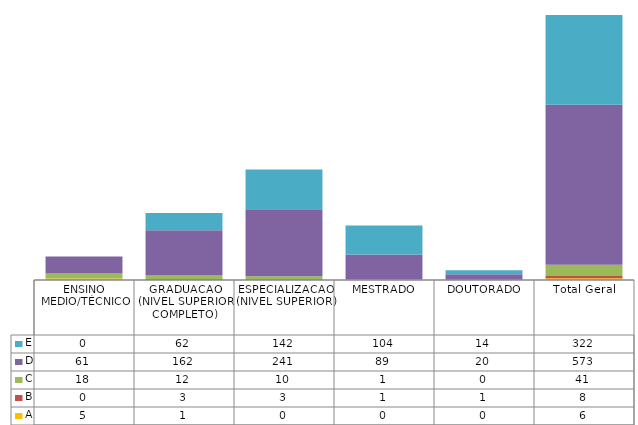
| Category | A | B | C | D | E |
|---|---|---|---|---|---|
| ENSINO MEDIO/TÉCNICO | 5 | 0 | 18 | 61 | 0 |
| GRADUACAO (NIVEL SUPERIOR COMPLETO) | 1 | 3 | 12 | 162 | 62 |
| ESPECIALIZACAO (NIVEL SUPERIOR) | 0 | 3 | 10 | 241 | 142 |
| MESTRADO | 0 | 1 | 1 | 89 | 104 |
| DOUTORADO | 0 | 1 | 0 | 20 | 14 |
| Total Geral | 6 | 8 | 41 | 573 | 322 |